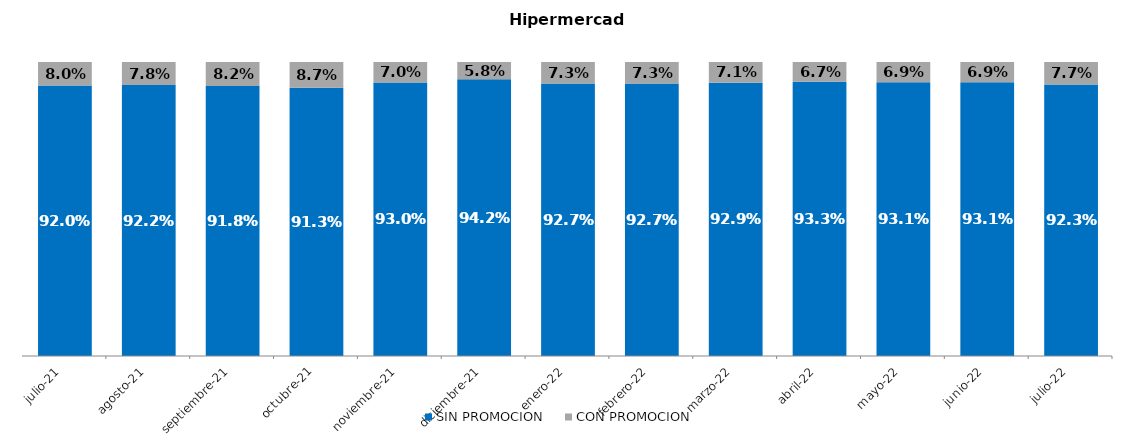
| Category | SIN PROMOCION   | CON PROMOCION   |
|---|---|---|
| 2021-07-01 | 0.92 | 0.08 |
| 2021-08-01 | 0.922 | 0.078 |
| 2021-09-01 | 0.918 | 0.082 |
| 2021-10-01 | 0.913 | 0.087 |
| 2021-11-01 | 0.93 | 0.07 |
| 2021-12-01 | 0.942 | 0.058 |
| 2022-01-01 | 0.927 | 0.073 |
| 2022-02-01 | 0.927 | 0.073 |
| 2022-03-01 | 0.929 | 0.071 |
| 2022-04-01 | 0.933 | 0.067 |
| 2022-05-01 | 0.931 | 0.069 |
| 2022-06-01 | 0.931 | 0.069 |
| 2022-07-01 | 0.923 | 0.077 |